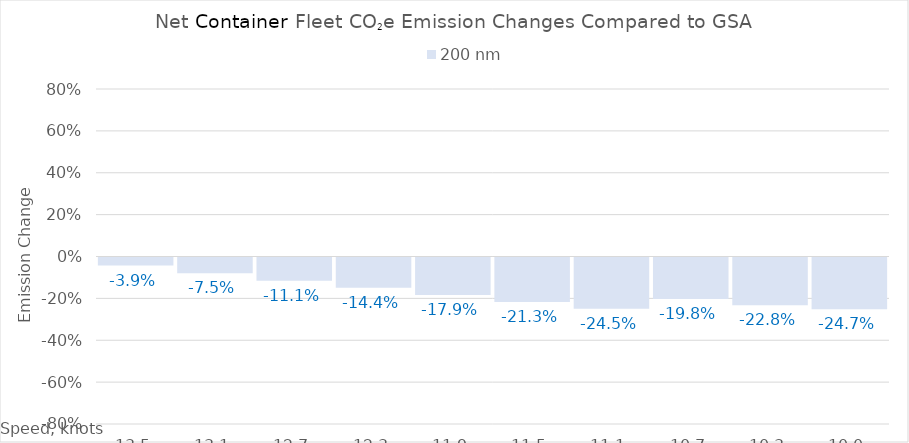
| Category | 200 |
|---|---|
| 13.5 | -0.039 |
| 13.1 | -0.075 |
| 12.7 | -0.111 |
| 12.299999999999999 | -0.144 |
| 11.899999999999999 | -0.179 |
| 11.499999999999998 | -0.213 |
| 11.099999999999998 | -0.245 |
| 10.699999999999998 | -0.198 |
| 10.299999999999997 | -0.228 |
| 10.0 | -0.247 |